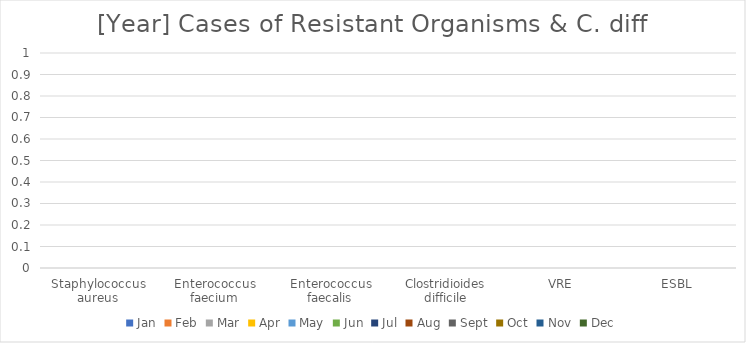
| Category | Jan | Feb | Mar | Apr | May | Jun | Jul | Aug | Sept | Oct | Nov | Dec |
|---|---|---|---|---|---|---|---|---|---|---|---|---|
| Staphylococcus aureus | 0 | 0 | 0 | 0 | 0 | 0 | 0 | 0 | 0 | 0 | 0 | 0 |
| Enterococcus faecium | 0 | 0 | 0 | 0 | 0 | 0 | 0 | 0 | 0 | 0 | 0 | 0 |
| Enterococcus faecalis | 0 | 0 | 0 | 0 | 0 | 0 | 0 | 0 | 0 | 0 | 0 | 0 |
| Clostridioides difficile | 0 | 0 | 0 | 0 | 0 | 0 | 0 | 0 | 0 | 0 | 0 | 0 |
| VRE | 0 | 0 | 0 | 0 | 0 | 0 | 0 | 0 | 0 | 0 | 0 | 0 |
| ESBL | 0 | 0 | 0 | 0 | 0 | 0 | 0 | 0 | 0 | 0 | 0 | 0 |